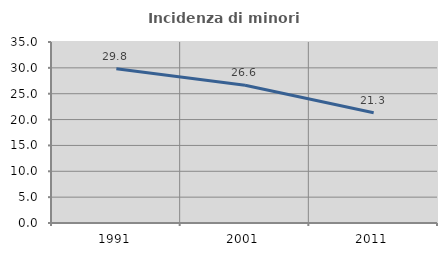
| Category | Incidenza di minori stranieri |
|---|---|
| 1991.0 | 29.825 |
| 2001.0 | 26.647 |
| 2011.0 | 21.305 |